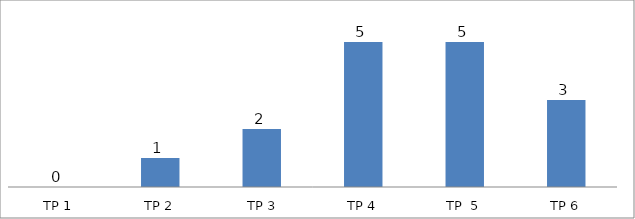
| Category | BIL. MURID |
|---|---|
| TP 1 | 0 |
| TP 2 | 1 |
|  TP 3 | 2 |
| TP 4 | 5 |
| TP  5 | 5 |
| TP 6 | 3 |